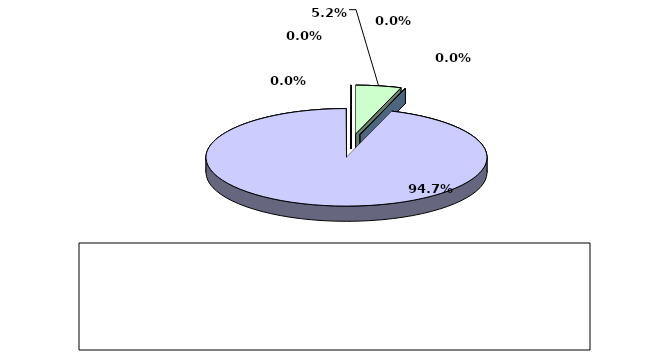
| Category | Series 0 |
|---|---|
| מזומנים ושווי מזומנים | 0.052 |
| אג"ח ממשלתיות סחירות | 0 |
| אג"ח קונצרני סחיר | 0 |
| ני"ע אחרים סחירים | 0.947 |
| פקדונות והלוואות | 0 |
| השקעות אחרות | 0 |